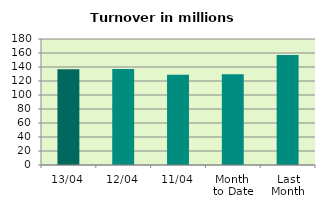
| Category | Series 0 |
|---|---|
| 13/04 | 136.905 |
| 12/04 | 137.04 |
| 11/04 | 128.758 |
| Month 
to Date | 129.599 |
| Last
Month | 157.238 |